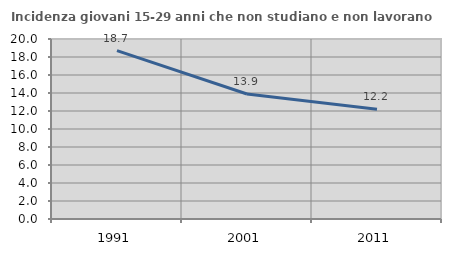
| Category | Incidenza giovani 15-29 anni che non studiano e non lavorano  |
|---|---|
| 1991.0 | 18.705 |
| 2001.0 | 13.889 |
| 2011.0 | 12.195 |